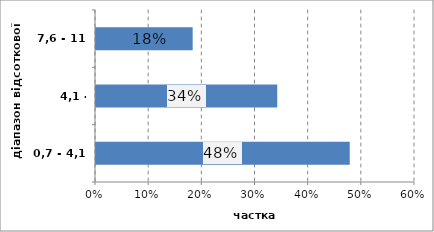
| Category | Series 0 |
|---|---|
| 0,7 - 4,1 | 0.477 |
| 4,1 - 7,59 | 0.341 |
| 7,6 - 11 | 0.182 |